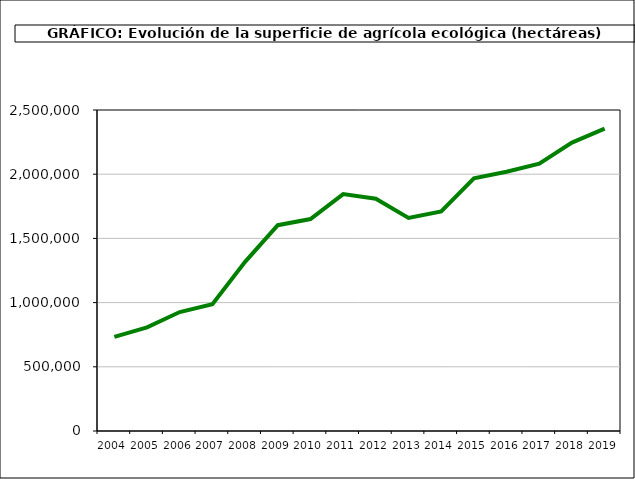
| Category | Superficie (ha) |
|---|---|
| 2004.0 | 733182 |
| 2005.0 | 807569 |
| 2006.0 | 926390 |
| 2007.0 | 988323 |
| 2008.0 | 1317752 |
| 2009.0 | 1602868 |
| 2010.0 | 1650866 |
| 2011.0 | 1845039 |
| 2012.0 | 1808492 |
| 2013.0 | 1659916 |
| 2014.0 | 1710493 |
| 2015.0 | 1968570 |
| 2016.0 | 2018802 |
| 2017.0 | 2082173 |
| 2018.0 | 2246475 |
| 2019.0 | 2354915.714 |